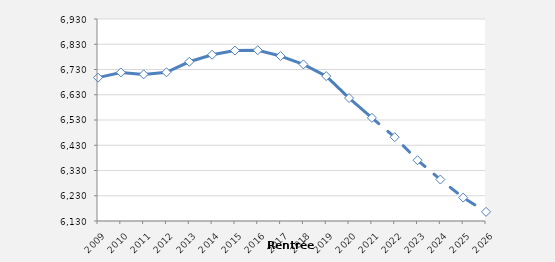
| Category | Series 0 |
|---|---|
| 2009.0 | 6697.7 |
| 2010.0 | 6718.3 |
| 2011.0 | 6710.7 |
| 2012.0 | 6718.9 |
| 2013.0 | 6760.6 |
| 2014.0 | 6788.6 |
| 2015.0 | 6805.2 |
| 2016.0 | 6806.4 |
| 2017.0 | 6783.3 |
| 2018.0 | 6750.2 |
| 2019.0 | 6703.8 |
| 2020.0 | 6616.862 |
| 2021.0 | 6538.576 |
| 2022.0 | 6461.995 |
| 2023.0 | 6370.753 |
| 2024.0 | 6294.223 |
| 2025.0 | 6222.656 |
| 2026.0 | 6166.22 |